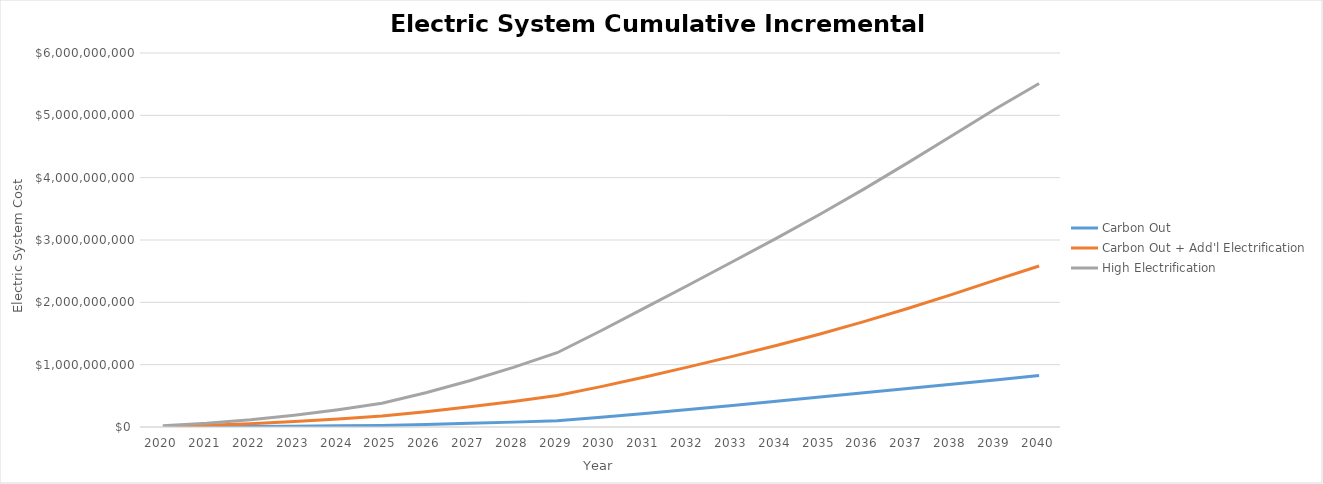
| Category | Carbon Out | Carbon Out + Add'l Electrification | High Electrification |
|---|---|---|---|
| 2020.0 | 1238060.835 | 9087047.942 | 19766509.751 |
| 2021.0 | 3854116.017 | 27578908.323 | 59818811.495 |
| 2022.0 | 7751167.294 | 53997727.374 | 116515085.606 |
| 2023.0 | 12860948.2 | 87970482.757 | 189054144.567 |
| 2024.0 | 19004101.832 | 129093658.409 | 277006171.662 |
| 2025.0 | 26000000 | 177000000 | 380000000 |
| 2026.0 | 42051090.887 | 246278898.148 | 550590808.667 |
| 2027.0 | 59472249.349 | 323878467.619 | 742627105.558 |
| 2028.0 | 78208774.212 | 409768967.151 | 956148635.836 |
| 2029.0 | 98465384.393 | 504218189.54 | 1191406096.855 |
| 2030.0 | 157012605.404 | 647953378.742 | 1544075272.016 |
| 2031.0 | 218272503.749 | 802696096.732 | 1910275267.809 |
| 2032.0 | 281523290.417 | 964060779.528 | 2278621478.758 |
| 2033.0 | 346738253.379 | 1132499103.933 | 2650695529.196 |
| 2034.0 | 413167649.536 | 1307445285.162 | 3026089606.994 |
| 2035.0 | 480641427.52 | 1492650590.16 | 3413711754.297 |
| 2036.0 | 548478981.659 | 1689800038.113 | 3815895653.802 |
| 2037.0 | 616933752.65 | 1901980930.947 | 4237535219.409 |
| 2038.0 | 685667163.938 | 2124623355.902 | 4667289123.873 |
| 2039.0 | 755537098.15 | 2355795227.125 | 5100938657.307 |
| 2040.0 | 825000000 | 2583000000 | 5511000000 |